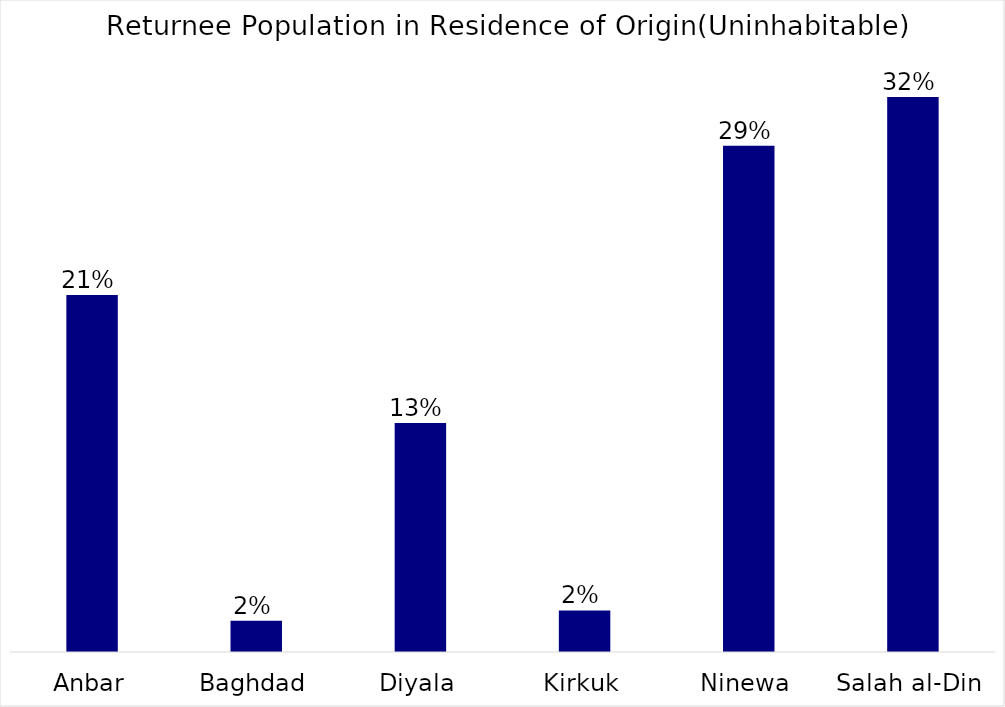
| Category | Series 0 |
|---|---|
| Anbar | 0.208 |
| Baghdad | 0.018 |
| Diyala | 0.133 |
| Kirkuk | 0.024 |
| Ninewa | 0.294 |
| Salah al-Din | 0.323 |